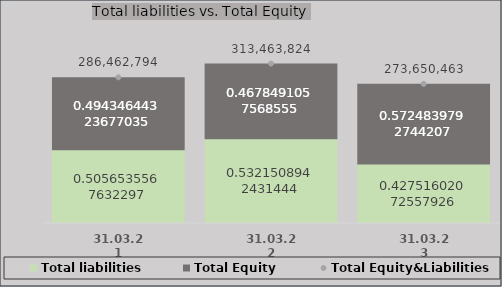
| Category | Total liabilities | Total Equity |
|---|---|---|
| 31.03.21 | 144850930.902 | 141611863.564 |
| 31.03.22 | 166810054.252 | 146653769.743 |
| 31.03.23 | 116989956.802 | 156660505.708 |